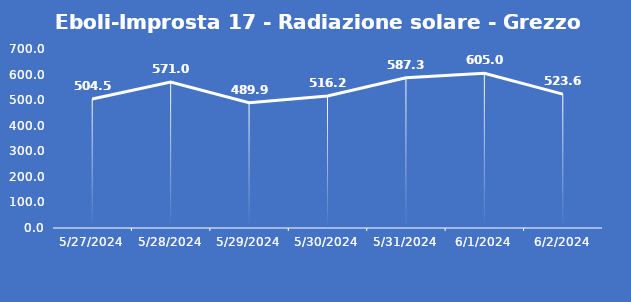
| Category | Eboli-Improsta 17 - Radiazione solare - Grezzo (W/m2) |
|---|---|
| 5/27/24 | 504.5 |
| 5/28/24 | 571 |
| 5/29/24 | 489.9 |
| 5/30/24 | 516.2 |
| 5/31/24 | 587.3 |
| 6/1/24 | 605 |
| 6/2/24 | 523.6 |